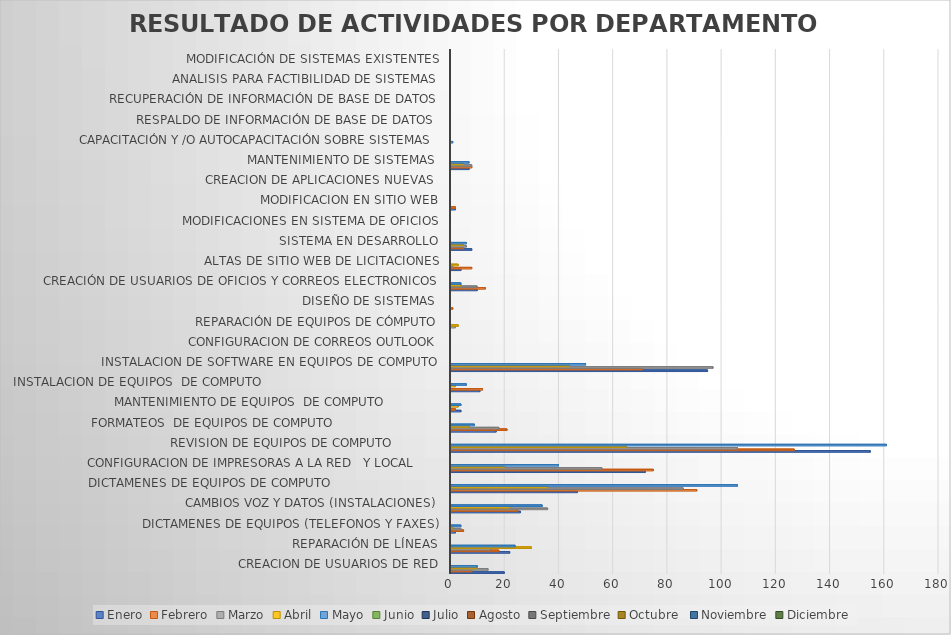
| Category | Enero | Febrero | Marzo | Abril | Mayo | Junio | Julio | Agosto | Septiembre | Octubre  | Noviembre | Diciembre |
|---|---|---|---|---|---|---|---|---|---|---|---|---|
| CREACION DE USUARIOS DE RED | 20 | 8 | 14 | 10 | 10 |  |  |  |  |  |  |  |
| REPARACIÓN DE LÍNEAS | 22 | 18 | 15 | 30 | 24 |  |  |  |  |  |  |  |
| DICTAMENES DE EQUIPOS (TELEFONOS Y FAXES) | 2 | 5 | 4 | 1 | 4 |  |  |  |  |  |  |  |
| CAMBIOS VOZ Y DATOS (INSTALACIONES) | 26 | 25 | 36 | 22 | 34 |  |  |  |  |  |  |  |
| DICTAMENES DE EQUIPOS DE COMPUTO                             | 47 | 91 | 86 | 36 | 106 |  |  |  |  |  |  |  |
| CONFIGURACION DE IMPRESORAS A LA RED   Y LOCAL       | 72 | 75 | 56 | 20 | 40 |  |  |  |  |  |  |  |
| REVISION DE EQUIPOS DE COMPUTO             | 155 | 127 | 106 | 65 | 161 |  |  |  |  |  |  |  |
| FORMATEOS  DE EQUIPOS DE COMPUTO                            | 17 | 21 | 18 | 7 | 9 |  |  |  |  |  |  |  |
| MANTENIMIENTO DE EQUIPOS  DE COMPUTO               | 4 | 2 | 0 | 3 | 4 |  |  |  |  |  |  |  |
| INSTALACION DE EQUIPOS  DE COMPUTO                                               | 11 | 12 | 0 | 2 | 6 |  |  |  |  |  |  |  |
| INSTALACION DE SOFTWARE EN EQUIPOS DE COMPUTO | 95 | 71 | 97 | 44 | 50 |  |  |  |  |  |  |  |
| CONFIGURACION DE CORREOS OUTLOOK | 0 | 0 | 0 | 0 | 0 |  |  |  |  |  |  |  |
| REPARACIÓN DE EQUIPOS DE CÓMPUTO | 0 | 0 | 2 | 3 | 0 |  |  |  |  |  |  |  |
| DISEÑO DE SISTEMAS  | 0 | 1 | 0 | 0 | 0 |  |  |  |  |  |  |  |
| CREACIÓN DE USUARIOS DE OFICIOS Y CORREOS ELECTRONICOS | 10 | 13 | 10 | 4 | 4 |  |  |  |  |  |  |  |
| ALTAS DE SITIO WEB DE LICITACIONES | 4 | 8 | 1 | 3 | 0 |  |  |  |  |  |  |  |
| SISTEMA EN DESARROLLO | 8 | 5 | 6 | 5 | 6 |  |  |  |  |  |  |  |
| MODIFICACIONES EN SISTEMA DE OFICIOS | 0 | 0 | 0 | 0 | 0 |  |  |  |  |  |  |  |
| MODIFICACION EN SITIO WEB | 2 | 2 | 0 | 0 | 0 |  |  |  |  |  |  |  |
| CREACION DE APLICACIONES NUEVAS  | 0 | 0 | 0 | 0 | 0 |  |  |  |  |  |  |  |
| MANTENIMIENTO DE SISTEMAS  | 7 | 8 | 8 | 5 | 7 |  |  |  |  |  |  |  |
| CAPACITACIÓN Y /O AUTOCAPACITACIÓN SOBRE SISTEMAS  | 0 | 0 | 0 | 0 | 1 |  |  |  |  |  |  |  |
| RESPALDO DE INFORMACIÓN DE BASE DE DATOS  | 0 | 0 | 0 | 0 | 0 |  |  |  |  |  |  |  |
| RECUPERACIÓN DE INFORMACIÓN DE BASE DE DATOS | 0 | 0 | 0 | 0 | 0 |  |  |  |  |  |  |  |
| ANALISIS PARA FACTIBILIDAD DE SISTEMAS  | 0 | 0 | 0 | 0 | 0 |  |  |  |  |  |  |  |
| MODIFICACIÓN DE SISTEMAS EXISTENTES | 0 | 0 | 0 | 0 | 0 |  |  |  |  |  |  |  |